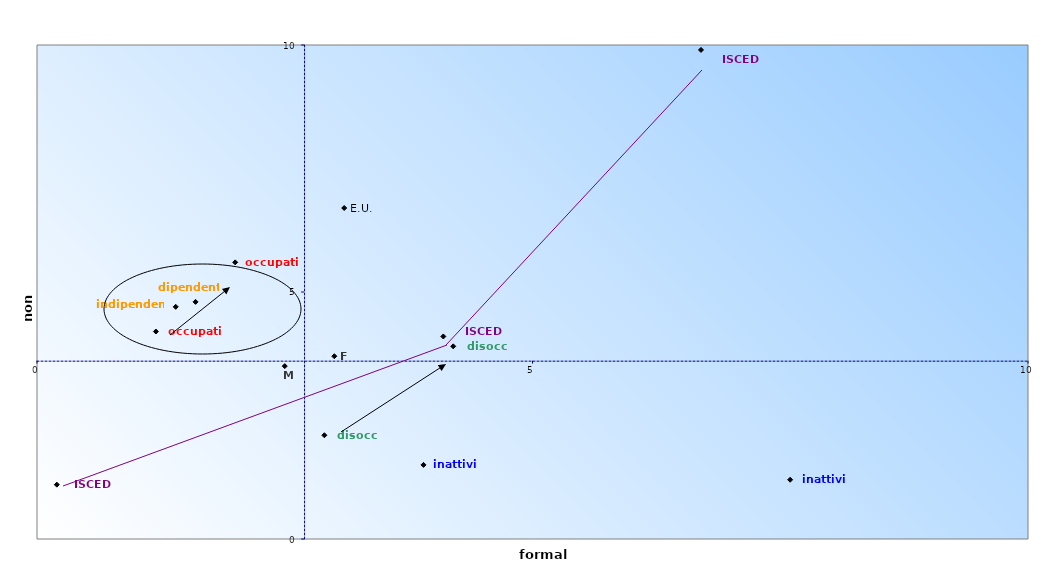
| Category | Series 1 |
|---|---|
| 1.2 | 4.2 |
| 2.0 | 5.6 |
| 2.9 | 2.1 |
| 4.2 | 3.9 |
| 7.6 | 1.2 |
| 3.9 | 1.5 |
| 0.2 | 1.1 |
| 4.1 | 4.1 |
| 6.7 | 9.9 |
| 1.6 | 4.8 |
| 1.4 | 4.7 |
| 2.5 | 3.5 |
| 3.0 | 3.7 |
| 3.1 | 6.7 |